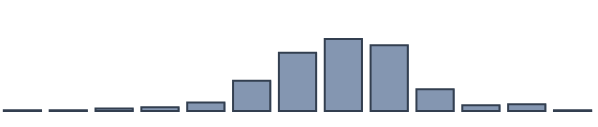
| Category | Series 0 |
|---|---|
| 0 | 0.261 |
| 1 | 0.261 |
| 2 | 0.87 |
| 3 | 1.391 |
| 4 | 3.043 |
| 5 | 10.913 |
| 6 | 20.957 |
| 7 | 25.957 |
| 8 | 23.696 |
| 9 | 7.826 |
| 10 | 2.087 |
| 11 | 2.435 |
| 12 | 0.304 |